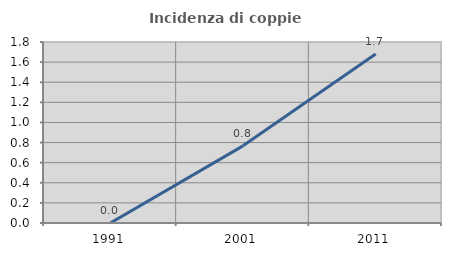
| Category | Incidenza di coppie miste |
|---|---|
| 1991.0 | 0 |
| 2001.0 | 0.767 |
| 2011.0 | 1.681 |